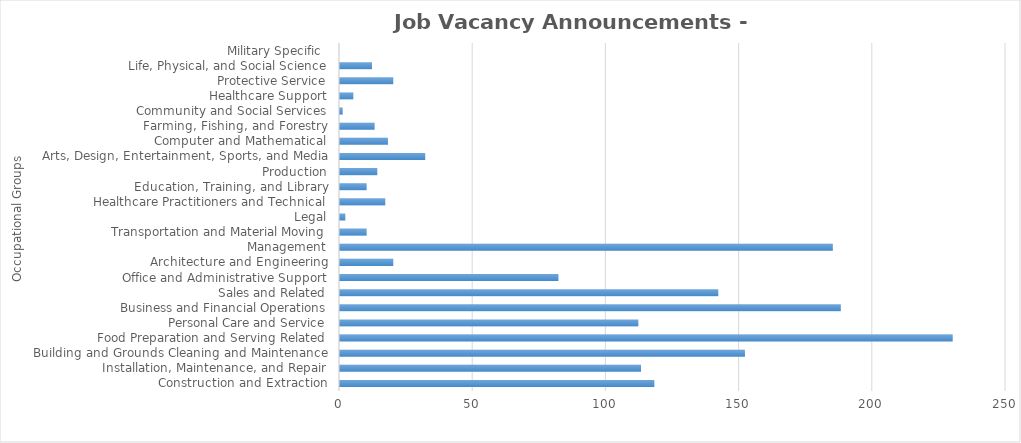
| Category | Total JVAs |
|---|---|
| Construction and Extraction | 118 |
| Installation, Maintenance, and Repair | 113 |
| Building and Grounds Cleaning and Maintenance | 152 |
| Food Preparation and Serving Related | 230 |
| Personal Care and Service | 112 |
| Business and Financial Operations | 188 |
| Sales and Related | 142 |
| Office and Administrative Support | 82 |
| Architecture and Engineering | 20 |
| Management | 185 |
| Transportation and Material Moving | 10 |
| Legal | 2 |
| Healthcare Practitioners and Technical | 17 |
| Education, Training, and Library | 10 |
| Production | 14 |
| Arts, Design, Entertainment, Sports, and Media | 32 |
| Computer and Mathematical | 18 |
| Farming, Fishing, and Forestry | 13 |
| Community and Social Services | 1 |
| Healthcare Support | 5 |
| Protective Service | 20 |
| Life, Physical, and Social Science | 12 |
| Military Specific  | 0 |